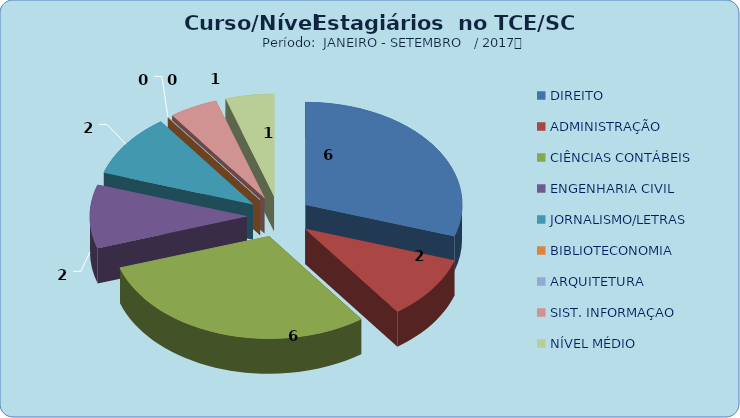
| Category | Series 0 |
|---|---|
| DIREITO | 6 |
| ADMINISTRAÇÃO | 2 |
| CIÊNCIAS CONTÁBEIS | 6 |
| ENGENHARIA CIVIL | 2 |
| JORNALISMO/LETRAS | 2 |
| BIBLIOTECONOMIA | 0 |
| ARQUITETURA | 0 |
| SIST. INFORMAÇAO | 1 |
| NÍVEL MÉDIO | 1 |